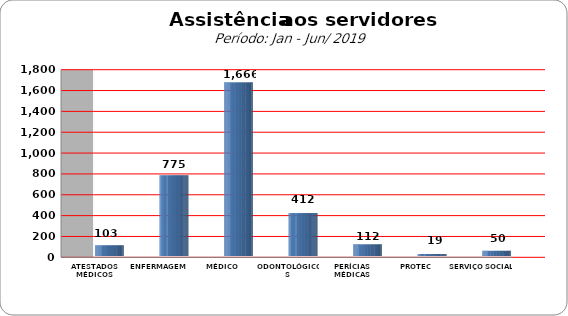
| Category | Series 0 |
|---|---|
| ATESTADOS MÉDICOS | 103 |
| ENFERMAGEM | 775 |
| MÉDICO | 1666 |
| ODONTOLÓGICOS | 412 |
| PERÍCIAS MÉDICAS | 112 |
| PROTEC | 19 |
| SERVIÇO SOCIAL | 50 |